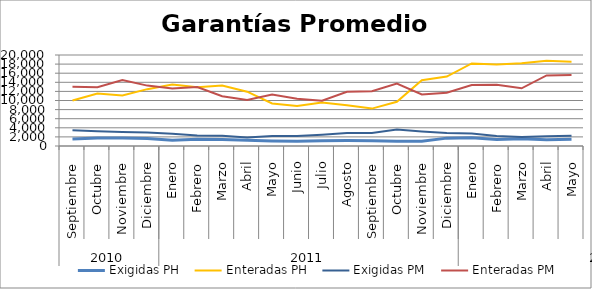
| Category | Exigidas PH | Enteradas PH | Exigidas PM | Enteradas PM |
|---|---|---|---|---|
| 0 | 1528.048 | 9989.528 | 3482.397 | 13040.893 |
| 1 | 1765.671 | 11522.563 | 3249.678 | 12931.878 |
| 2 | 1744.818 | 11123.372 | 3083.204 | 14519.409 |
| 3 | 1659.203 | 12493.623 | 2971.808 | 13273.812 |
| 4 | 1282.931 | 13511.197 | 2715.795 | 12631.271 |
| 5 | 1469.886 | 12912.935 | 2313.398 | 12967.84 |
| 6 | 1451.049 | 13292.147 | 2234.5 | 10944.124 |
| 7 | 1243.266 | 11940.059 | 1876.192 | 10106.188 |
| 8 | 1094.477 | 9346.935 | 2211.516 | 11309.35 |
| 9 | 1038.181 | 8772.488 | 2185.859 | 10360.845 |
| 10 | 1150.33 | 9583.522 | 2484.933 | 9954.534 |
| 11 | 1204.945 | 8947.225 | 2874.347 | 11912.953 |
| 12 | 1181.135 | 8218.837 | 2868.226 | 12046.458 |
| 13 | 1047.181 | 9725.758 | 3619.145 | 13704.352 |
| 14 | 1067.214 | 14456.861 | 3177.175 | 11327.495 |
| 15 | 1729.716 | 15271.717 | 2830.669 | 11719.895 |
| 16 | 1828.564 | 18155.583 | 2744.93 | 13413.991 |
| 17 | 1451.155 | 17917.734 | 2215.902 | 13440.832 |
| 18 | 1587.31 | 18166.129 | 1968.766 | 12673.714 |
| 19 | 1353.003 | 18741.256 | 2118.782 | 15515.723 |
| 20 | 1464.668 | 18540.927 | 2278.002 | 15625.393 |